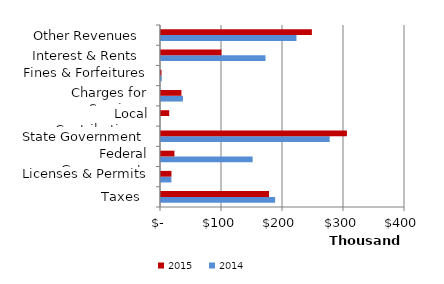
| Category | 2014 | 2015 |
|---|---|---|
|  Taxes  | 187087 | 177084 |
|  Licenses & Permits  | 16982 | 17149 |
|  Federal Government  | 150242 | 21999 |
|  State Government  | 276490 | 304793 |
|  Local Contributions  | 0 | 13442 |
|  Charges for Services  | 36013 | 33477 |
|  Fines & Forfeitures  | 1263 | 869 |
|  Interest & Rents  | 171275 | 99035 |
|  Other Revenues  | 222076 | 247328 |